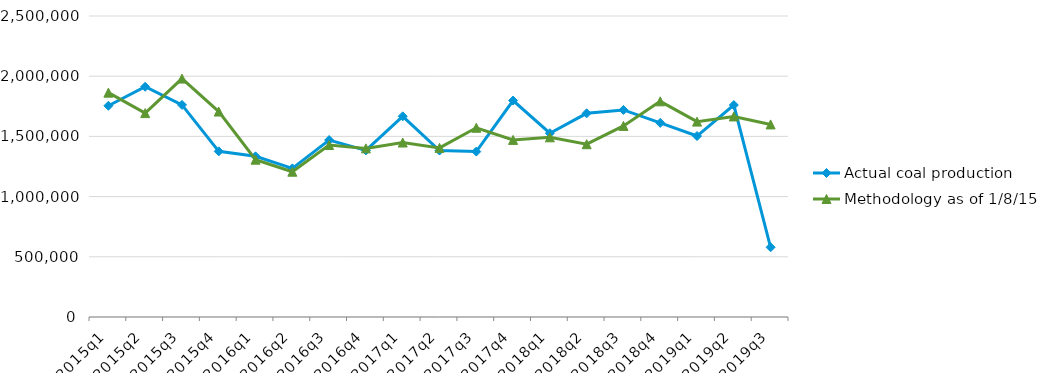
| Category | Actual coal production | Methodology as of 1/8/15 |
|---|---|---|
| 2015q1 | 1754528 | 1863294 |
| 2015q2 | 1912314 | 1693537 |
| 2015q3 | 1761884 | 1980139 |
| 2015q4 | 1375829 | 1706319 |
| 2016q1 | 1334542 | 1306686 |
| 2016q2 | 1234643 | 1206562 |
| 2016q3 | 1469610 | 1428388 |
| 2016q4 | 1384055 | 1400574 |
| 2017q1 | 1666929 | 1449135 |
| 2017q2 | 1382746 | 1404592 |
| 2017q3 | 1373873 | 1571648 |
| 2017q4 | 1797844 | 1470964 |
| 2018q1 | 1526414 | 1492366 |
| 2018q2 | 1691746 | 1435185 |
| 2018q3 | 1720042 | 1587124 |
| 2018q4 | 1612215 | 1791194 |
| 2019q1 | 1503017 | 1622784 |
| 2019q2 | 1760409 | 1665898 |
| 2019q3 | 579082 | 1599390 |